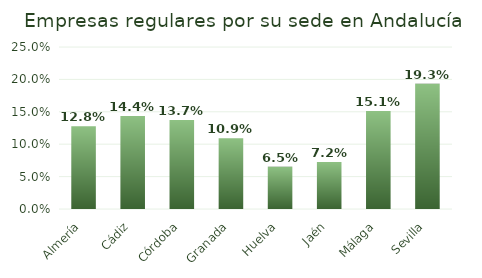
| Category | % empresas |
|---|---|
| Almería | 0.128 |
| Cádiz | 0.144 |
| Córdoba | 0.137 |
| Granada | 0.109 |
| Huelva | 0.065 |
| Jaén | 0.072 |
| Málaga | 0.151 |
| Sevilla | 0.193 |